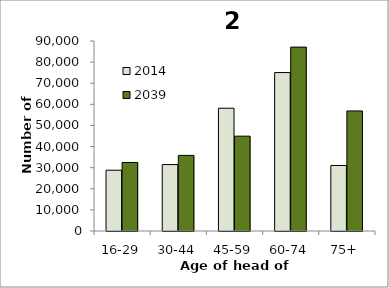
| Category | 2014 | 2039 |
|---|---|---|
| 16-29 | 28795 | 32461 |
| 30-44 | 31463 | 35814 |
| 45-59 | 58154 | 44921 |
| 60-74 | 75053 | 87107 |
| 75+ | 31034 | 56868 |